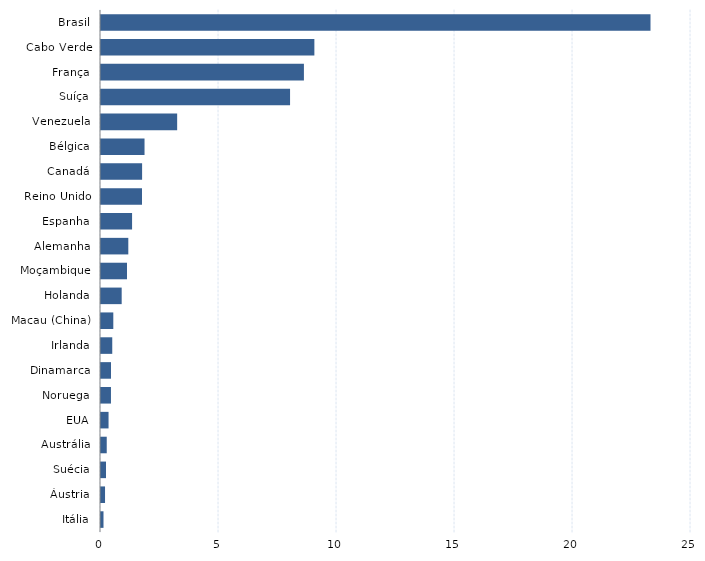
| Category | Series 0 |
|---|---|
| Itália | 0.106 |
| Áustria | 0.171 |
| Suécia | 0.212 |
| Austrália | 0.243 |
| EUA | 0.32 |
| Noruega | 0.422 |
| Dinamarca | 0.423 |
| Irlanda | 0.477 |
| Macau (China) | 0.521 |
| Holanda | 0.876 |
| Moçambique | 1.101 |
| Alemanha | 1.157 |
| Espanha | 1.317 |
| Reino Unido | 1.737 |
| Canadá | 1.742 |
| Bélgica | 1.844 |
| Venezuela | 3.227 |
| Suíça | 8.011 |
| França | 8.598 |
| Cabo Verde | 9.041 |
| Brasil | 23.284 |